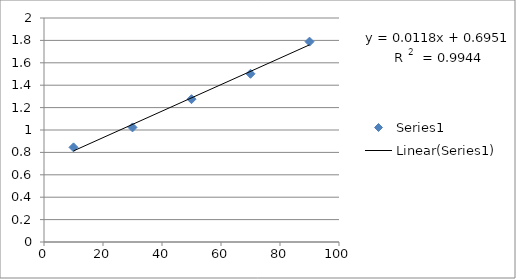
| Category | Series 0 |
|---|---|
| 10.0 | 0.845 |
| 30.0 | 1.023 |
| 50.0 | 1.275 |
| 70.0 | 1.502 |
| 90.0 | 1.789 |